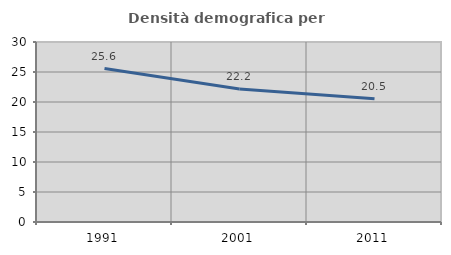
| Category | Densità demografica |
|---|---|
| 1991.0 | 25.576 |
| 2001.0 | 22.167 |
| 2011.0 | 20.527 |